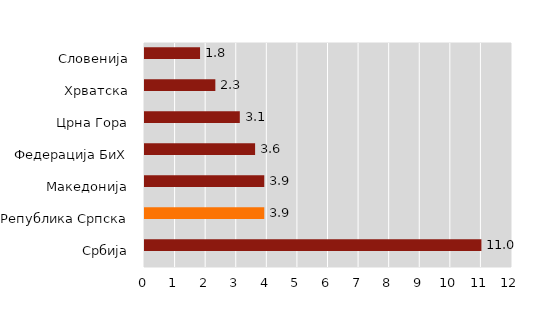
| Category | Series 0 | Series 1 |
|---|---|---|
| Србија |  | 11 |
| Република Српска |  | 3.9 |
| Македонија |  | 3.9 |
| Федерација БиХ |  | 3.6 |
| Црна Гора |  | 3.1 |
| Хрватска |  | 2.3 |
| Словенија |  | 1.8 |